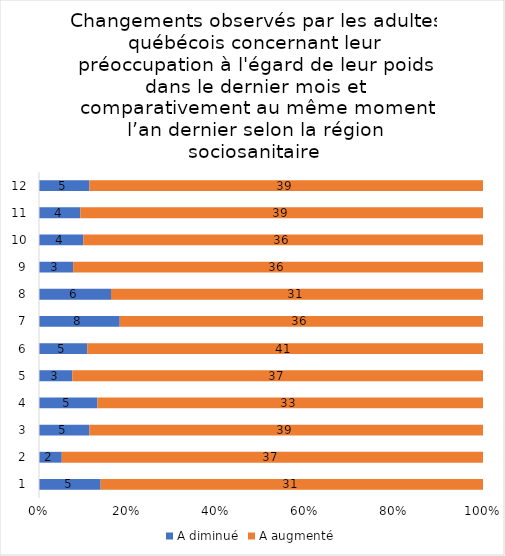
| Category | A diminué | A augmenté |
|---|---|---|
| 0 | 5 | 31 |
| 1 | 2 | 37 |
| 2 | 5 | 39 |
| 3 | 5 | 33 |
| 4 | 3 | 37 |
| 5 | 5 | 41 |
| 6 | 8 | 36 |
| 7 | 6 | 31 |
| 8 | 3 | 36 |
| 9 | 4 | 36 |
| 10 | 4 | 39 |
| 11 | 5 | 39 |